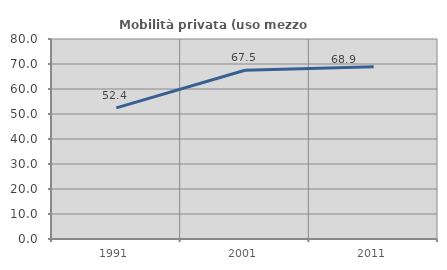
| Category | Mobilità privata (uso mezzo privato) |
|---|---|
| 1991.0 | 52.444 |
| 2001.0 | 67.52 |
| 2011.0 | 68.901 |